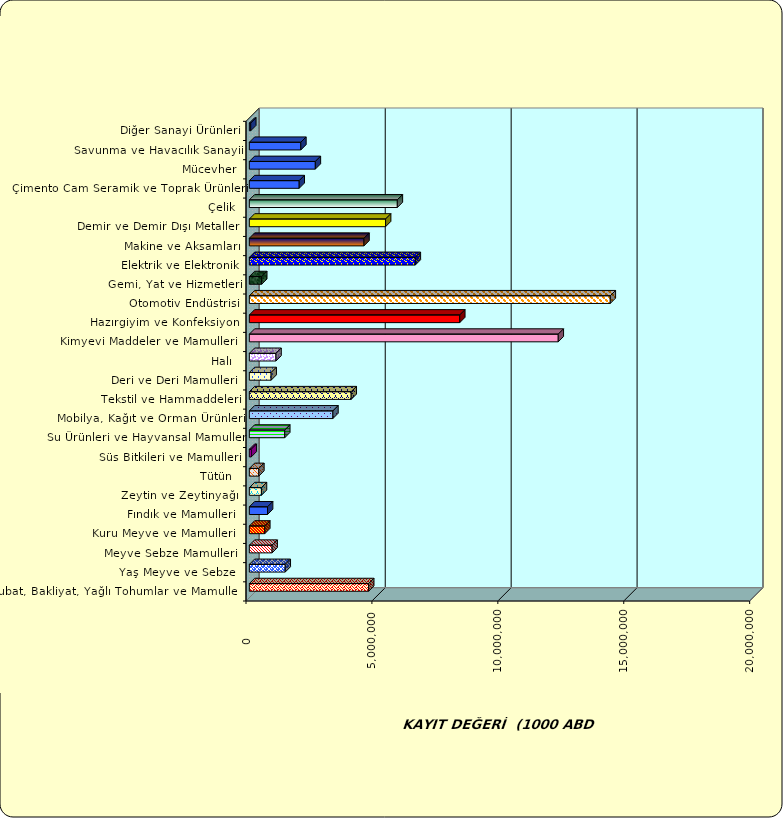
| Category | Series 0 |
|---|---|
|  Hububat, Bakliyat, Yağlı Tohumlar ve Mamulleri  | 4738436.946 |
|  Yaş Meyve ve Sebze   | 1424576.479 |
|  Meyve Sebze Mamulleri  | 903934.991 |
|  Kuru Meyve ve Mamulleri   | 613217.156 |
|  Fındık ve Mamulleri  | 722638.082 |
|  Zeytin ve Zeytinyağı  | 480269.49 |
|  Tütün  | 376086.685 |
|  Süs Bitkileri ve Mamulleri | 76511.537 |
|  Su Ürünleri ve Hayvansal Mamuller | 1405302.49 |
|  Mobilya, Kağıt ve Orman Ürünleri | 3317717.942 |
|  Tekstil ve Hammaddeleri | 4044371.62 |
|  Deri ve Deri Mamulleri  | 865669.731 |
|  Halı  | 1057535.348 |
|  Kimyevi Maddeler ve Mamulleri   | 12266170.422 |
|  Hazırgiyim ve Konfeksiyon  | 8355036.798 |
|  Otomotiv Endüstrisi | 14332483.529 |
|  Gemi, Yat ve Hizmetleri | 489885.232 |
|  Elektrik ve Elektronik | 6589402.98 |
|  Makine ve Aksamları | 4552357.238 |
|  Demir ve Demir Dışı Metaller  | 5409797.775 |
|  Çelik | 5876173.962 |
|  Çimento Cam Seramik ve Toprak Ürünleri | 1979164.656 |
|  Mücevher | 2620098.426 |
|  Savunma ve Havacılık Sanayii | 2044435.634 |
|  Diğer Sanayi Ürünleri | 55212.769 |